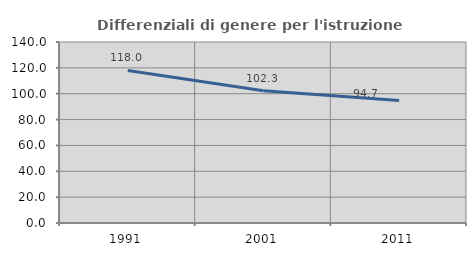
| Category | Differenziali di genere per l'istruzione superiore |
|---|---|
| 1991.0 | 118.004 |
| 2001.0 | 102.316 |
| 2011.0 | 94.725 |